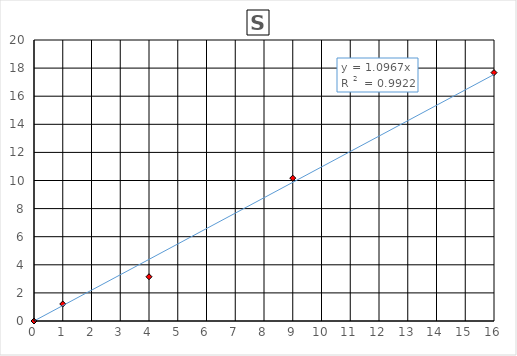
| Category | S |
|---|---|
| 0.0 | 0 |
| 1.0 | 1.21 |
| 4.0 | 3.15 |
| 9.0 | 10.17 |
| 16.0 | 17.68 |